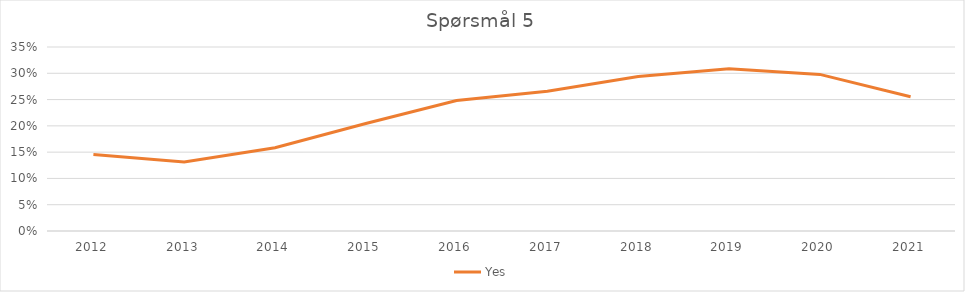
| Category | Yes |
|---|---|
| 2012.0 | 0.146 |
| 2013.0 | 0.131 |
| 2014.0 | 0.158 |
| 2015.0 | 0.205 |
| 2016.0 | 0.248 |
| 2017.0 | 0.266 |
| 2018.0 | 0.294 |
| 2019.0 | 0.309 |
| 2020.0 | 0.298 |
| 2021.0 | 0.255 |